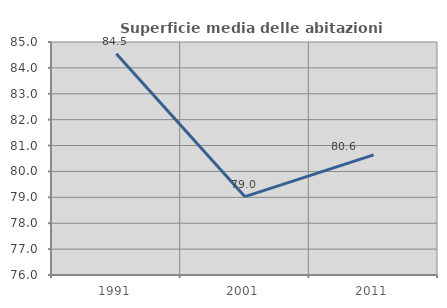
| Category | Superficie media delle abitazioni occupate |
|---|---|
| 1991.0 | 84.545 |
| 2001.0 | 79.027 |
| 2011.0 | 80.639 |